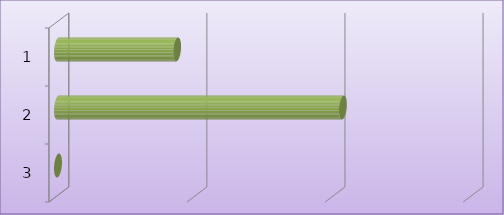
| Category | Series 0 |
|---|---|
| 0 | 862500 |
| 1 | 2063100 |
| 2 | 0 |